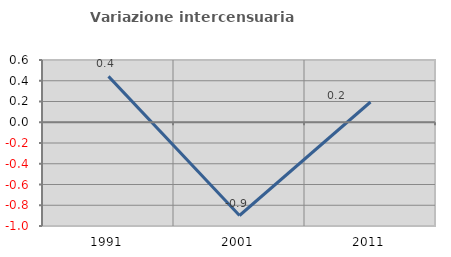
| Category | Variazione intercensuaria annua |
|---|---|
| 1991.0 | 0.442 |
| 2001.0 | -0.899 |
| 2011.0 | 0.195 |